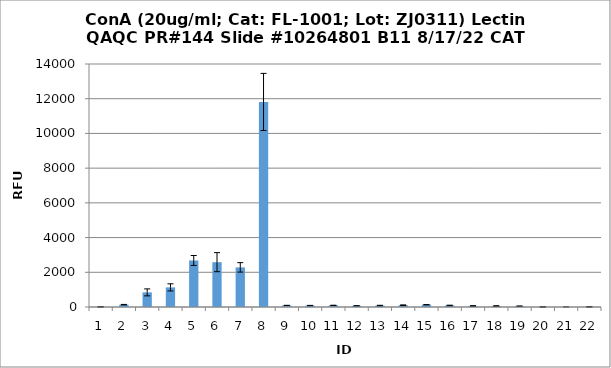
| Category | Series 0 |
|---|---|
| 0 | 9 |
| 1 | 135.5 |
| 2 | 842.5 |
| 3 | 1130.5 |
| 4 | 2680.5 |
| 5 | 2582.75 |
| 6 | 2283.25 |
| 7 | 11812.75 |
| 8 | 91.25 |
| 9 | 83.75 |
| 10 | 94.25 |
| 11 | 68 |
| 12 | 83.75 |
| 13 | 101 |
| 14 | 132 |
| 15 | 89.5 |
| 16 | 61.25 |
| 17 | 58 |
| 18 | 48.5 |
| 19 | 4.25 |
| 20 | 1.25 |
| 21 | 7.25 |